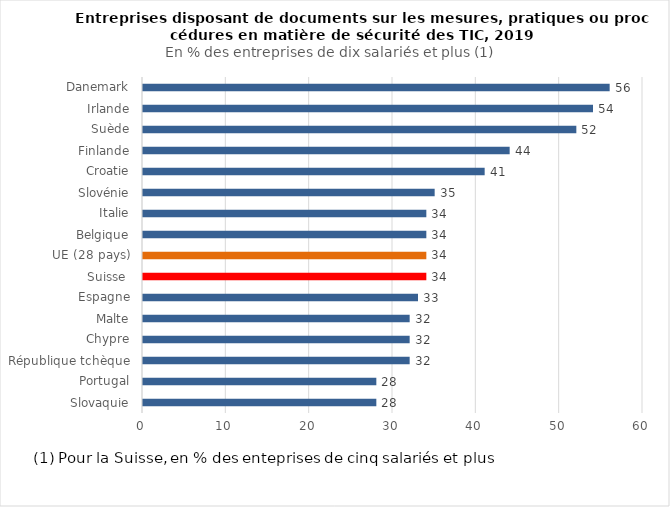
| Category | Series 0 |
|---|---|
| Slovaquie | 28 |
| Portugal | 28 |
| République tchèque | 32 |
| Chypre | 32 |
| Malte | 32 |
| Espagne | 33 |
| Suisse  | 34 |
| UE (28 pays) | 34 |
| Belgique | 34 |
| Italie | 34 |
| Slovénie | 35 |
| Croatie | 41 |
| Finlande | 44 |
| Suède | 52 |
| Irlande | 54 |
| Danemark | 56 |